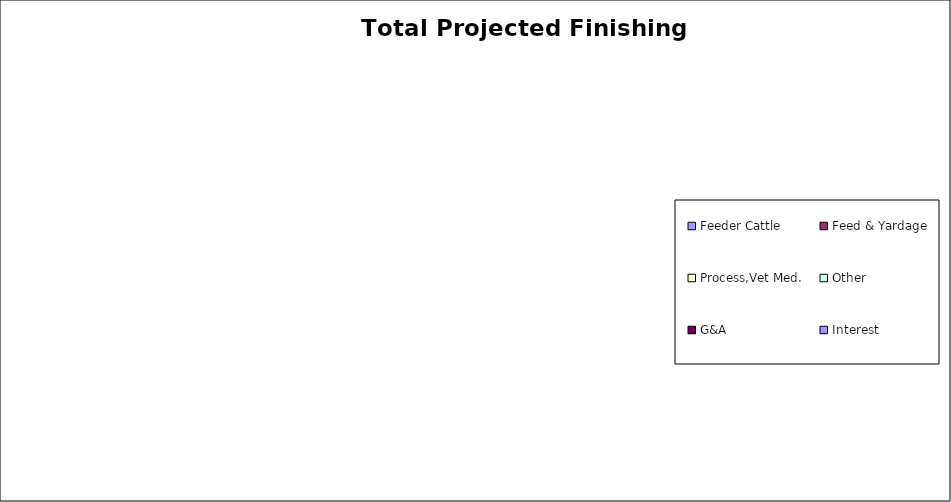
| Category | Total |
|---|---|
| Feeder Cattle | 0 |
| Feed & Yardage | 0 |
| Process,Vet Med. | 0 |
| Other | 0 |
| G&A | 0 |
| Interest | 0 |